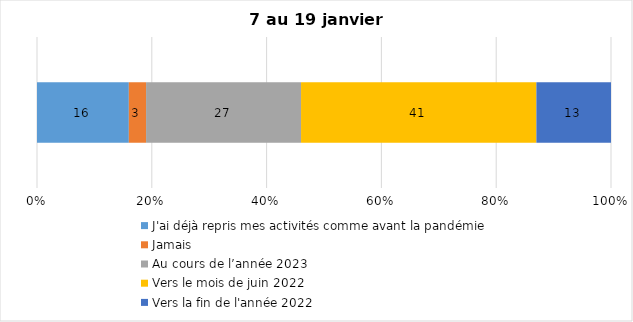
| Category | J'ai déjà repris mes activités comme avant la pandémie | Jamais | Au cours de l’année 2023 | Vers le mois de juin 2022 | Vers la fin de l'année 2022 |
|---|---|---|---|---|---|
| 0 | 16 | 3 | 27 | 41 | 13 |